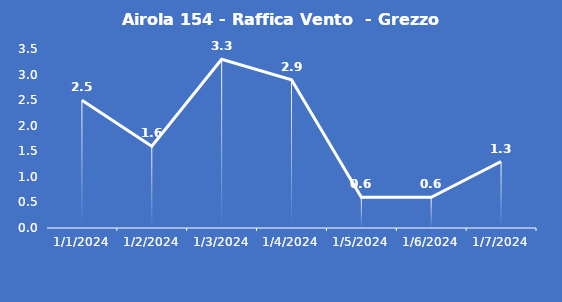
| Category | Airola 154 - Raffica Vento  - Grezzo (m/s) |
|---|---|
| 1/1/24 | 2.5 |
| 1/2/24 | 1.6 |
| 1/3/24 | 3.3 |
| 1/4/24 | 2.9 |
| 1/5/24 | 0.6 |
| 1/6/24 | 0.6 |
| 1/7/24 | 1.3 |